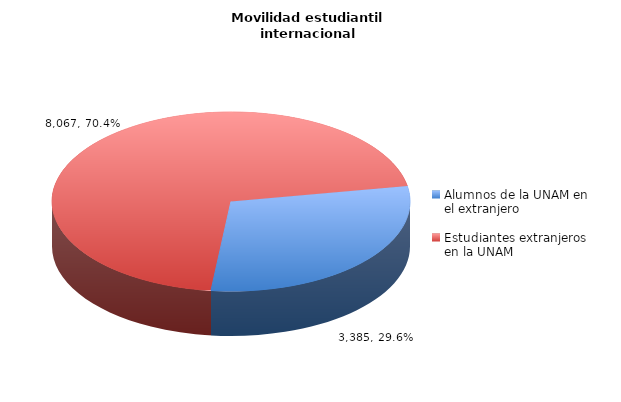
| Category | Series 0 |
|---|---|
| Alumnos de la UNAM en el extranjero | 3385 |
| Estudiantes extranjeros en la UNAM | 8067 |